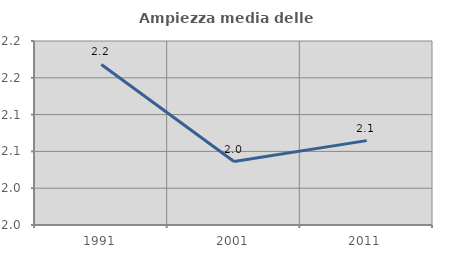
| Category | Ampiezza media delle famiglie |
|---|---|
| 1991.0 | 2.168 |
| 2001.0 | 2.036 |
| 2011.0 | 2.065 |